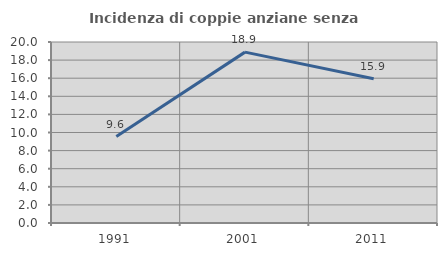
| Category | Incidenza di coppie anziane senza figli  |
|---|---|
| 1991.0 | 9.554 |
| 2001.0 | 18.881 |
| 2011.0 | 15.936 |